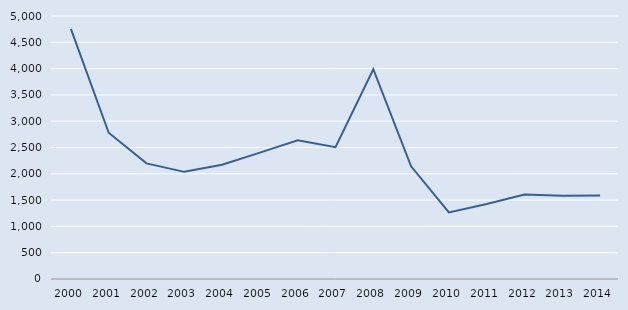
| Category | Series 0 |
|---|---|
| 2000.0 | 4756 |
| 2001.0 | 2780 |
| 2002.0 | 2198 |
| 2003.0 | 2037 |
| 2004.0 | 2173 |
| 2005.0 | 2403 |
| 2006.0 | 2638 |
| 2007.0 | 2506 |
| 2008.0 | 3988 |
| 2009.0 | 2143 |
| 2010.0 | 1266 |
| 2011.0 | 1426 |
| 2012.0 | 1607 |
| 2013.0 | 1585 |
| 2014.0 | 1587 |